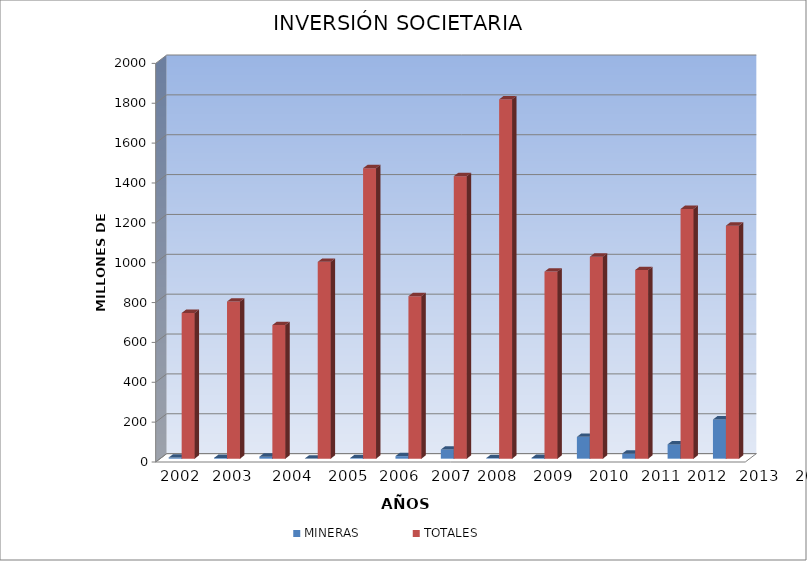
| Category | MINERAS | TOTALES |
|---|---|---|
| 0 | 6 | 731.22 |
| 1 | 3.94 | 788.46 |
| 2 | 10.09 | 670.51 |
| 3 | 0.85 | 987.56 |
| 4 | 3.07 | 1457.42 |
| 5 | 12.87 | 815.22 |
| 6 | 46.03 | 1417.34 |
| 7 | 2.87 | 1802.99 |
| 8 | 3.8 | 938.59 |
| 9 | 109.65 | 1013.33 |
| 10 | 25.79 | 946.66 |
| 11 | 71.62 | 1252.97 |
| 12 | 196.675 | 1169.3 |